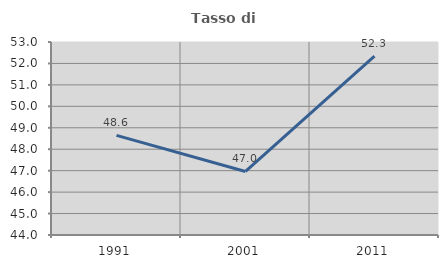
| Category | Tasso di occupazione   |
|---|---|
| 1991.0 | 48.647 |
| 2001.0 | 46.962 |
| 2011.0 | 52.343 |